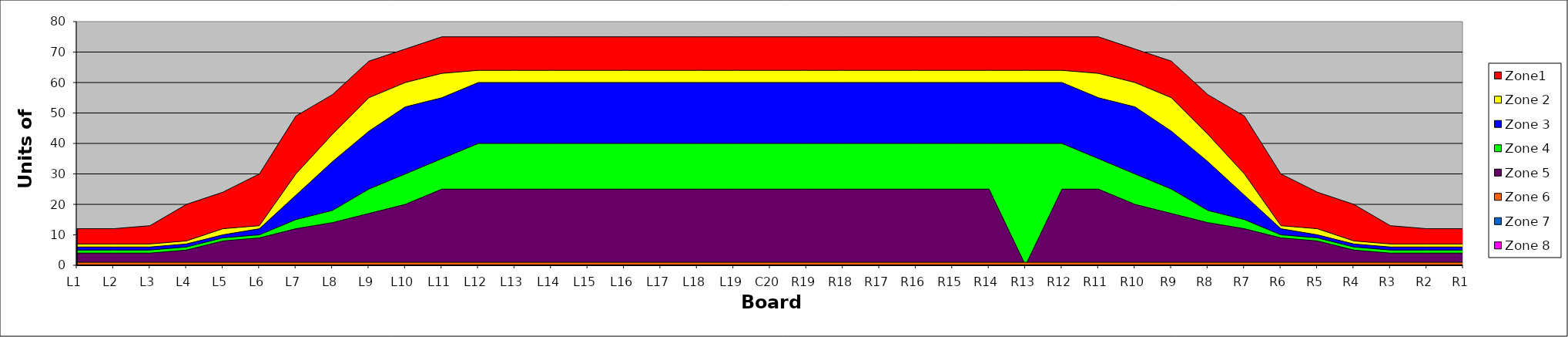
| Category | Zone1 | Zone 2 | Zone 3 | Zone 4 | Zone 5 | Zone 6 | Zone 7 | Zone 8 |
|---|---|---|---|---|---|---|---|---|
| L1 | 12 | 7 | 6 | 5 | 4 | 1 |  |  |
| L2 | 12 | 7 | 6 | 5 | 4 | 1 |  |  |
| L3 | 13 | 7 | 6 | 5 | 4 | 1 |  |  |
| L4 | 20 | 8 | 7 | 6 | 5 | 1 |  |  |
| L5 | 24 | 12 | 10 | 9 | 8 | 1 |  |  |
| L6 | 30 | 13 | 12 | 10 | 9 | 1 |  |  |
| L7 | 49 | 30 | 23 | 15 | 12 | 1 |  |  |
| L8 | 56 | 43 | 34 | 18 | 14 | 1 |  |  |
| L9 | 67 | 55 | 44 | 25 | 17 | 1 |  |  |
| L10 | 71 | 60 | 52 | 30 | 20 | 1 |  |  |
| L11 | 75 | 63 | 55 | 35 | 25 | 1 |  |  |
| L12 | 75 | 64 | 60 | 40 | 25 | 1 |  |  |
| L13 | 75 | 64 | 60 | 40 | 25 | 1 |  |  |
| L14 | 75 | 64 | 60 | 40 | 25 | 1 |  |  |
| L15 | 75 | 64 | 60 | 40 | 25 | 1 |  |  |
| L16 | 75 | 64 | 60 | 40 | 25 | 1 |  |  |
| L17 | 75 | 64 | 60 | 40 | 25 | 1 |  |  |
| L18 | 75 | 64 | 60 | 40 | 25 | 1 |  |  |
| L19 | 75 | 64 | 60 | 40 | 25 | 1 |  |  |
| C20 | 75 | 64 | 60 | 40 | 25 | 1 |  |  |
| R19 | 75 | 64 | 60 | 40 | 25 | 1 |  |  |
| R18 | 75 | 64 | 60 | 40 | 25 | 1 |  |  |
| R17 | 75 | 64 | 60 | 40 | 25 | 1 |  |  |
| R16 | 75 | 64 | 60 | 40 | 25 | 1 |  |  |
| R15 | 75 | 64 | 60 | 40 | 25 | 1 |  |  |
| R14 | 75 | 64 | 60 | 40 | 25 | 1 |  |  |
| R13 | 75 | 64 | 60 | 40 | 0 | 1 |  |  |
| R12 | 75 | 64 | 60 | 40 | 25 | 1 |  |  |
| R11 | 75 | 63 | 55 | 35 | 25 | 1 |  |  |
| R10 | 71 | 60 | 52 | 30 | 20 | 1 |  |  |
| R9 | 67 | 55 | 44 | 25 | 17 | 1 |  |  |
| R8 | 56 | 43 | 34 | 18 | 14 | 1 |  |  |
| R7 | 49 | 30 | 23 | 15 | 12 | 1 |  |  |
| R6 | 30 | 13 | 12 | 10 | 9 | 1 |  |  |
| R5 | 24 | 12 | 10 | 9 | 8 | 1 |  |  |
| R4 | 20 | 8 | 7 | 6 | 5 | 1 |  |  |
| R3 | 13 | 7 | 6 | 5 | 4 | 1 |  |  |
| R2 | 12 | 7 | 6 | 5 | 4 | 1 |  |  |
| R1 | 12 | 7 | 6 | 5 | 4 | 1 |  |  |